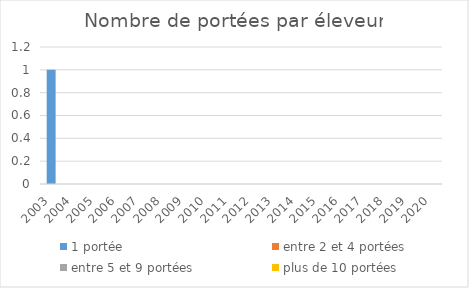
| Category | 1 portée | entre 2 et 4 portées | entre 5 et 9 portées | plus de 10 portées |
|---|---|---|---|---|
| 2003.0 | 1 | 0 | 0 | 0 |
| 2004.0 | 0 | 0 | 0 | 0 |
| 2005.0 | 0 | 0 | 0 | 0 |
| 2006.0 | 0 | 0 | 0 | 0 |
| 2007.0 | 0 | 0 | 0 | 0 |
| 2008.0 | 0 | 0 | 0 | 0 |
| 2009.0 | 0 | 0 | 0 | 0 |
| 2010.0 | 0 | 0 | 0 | 0 |
| 2011.0 | 0 | 0 | 0 | 0 |
| 2012.0 | 0 | 0 | 0 | 0 |
| 2013.0 | 0 | 0 | 0 | 0 |
| 2014.0 | 0 | 0 | 0 | 0 |
| 2015.0 | 0 | 0 | 0 | 0 |
| 2016.0 | 0 | 0 | 0 | 0 |
| 2017.0 | 0 | 0 | 0 | 0 |
| 2018.0 | 0 | 0 | 0 | 0 |
| 2019.0 | 0 | 0 | 0 | 0 |
| 2020.0 | 0 | 0 | 0 | 0 |